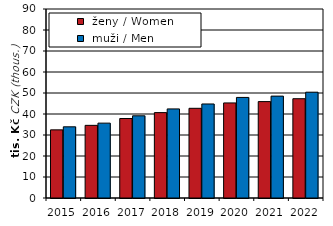
| Category |  ženy / Women |  muži / Men |
|---|---|---|
| 2015.0 | 32.442 | 33.895 |
| 2016.0 | 34.592 | 35.655 |
| 2017.0 | 37.852 | 39.139 |
| 2018.0 | 40.66 | 42.42 |
| 2019.0 | 42.711 | 44.776 |
| 2020.0 | 45.275 | 47.888 |
| 2021.0 | 45.903 | 48.516 |
| 2022.0 | 47.278 | 50.387 |